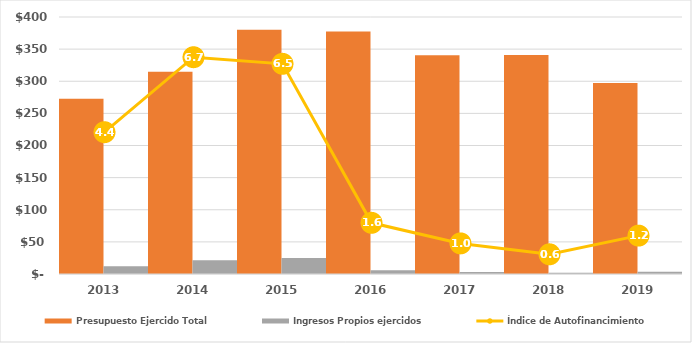
| Category | Presupuesto Ejercido Total | Ingresos Propios ejercidos |
|---|---|---|
| 2013.0 | 272702.822 | 12037.736 |
| 2014.0 | 314864.8 | 21248.3 |
| 2015.0 | 380021.6 | 24861.4 |
| 2016.0 | 377416.6 | 6012.7 |
| 2017.0 | 340334.7 | 3242.2 |
| 2018.0 | 340765 | 2090 |
| 2019.0 | 297383.7 | 3552.847 |